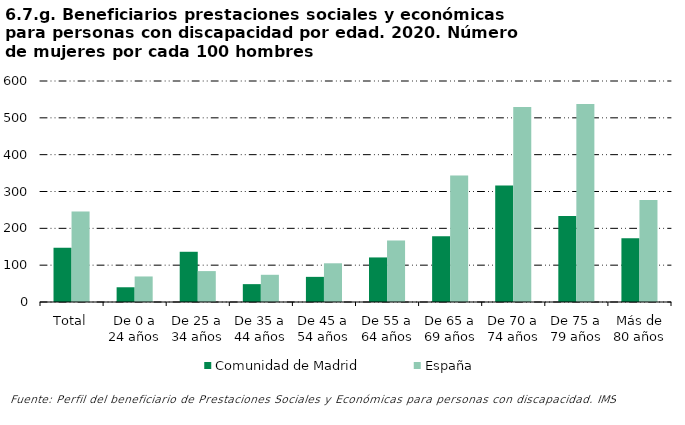
| Category | Comunidad de Madrid | España |
|---|---|---|
| Total | 147.132 | 245.565 |
| De 0 a 24 años | 40 | 69.333 |
| De 25 a 34 años | 136.364 | 83.898 |
| De 35 a 44 años | 48.485 | 73.889 |
| De 45 a 54 años | 68.254 | 105.105 |
| De 55 a 64 años | 120.988 | 166.957 |
| De 65 a 69 años | 178.378 | 343.503 |
| De 70 a 74 años | 316 | 529.452 |
| De 75 a 79 años | 233.333 | 537.342 |
| Más de 80 años | 173.276 | 276.599 |